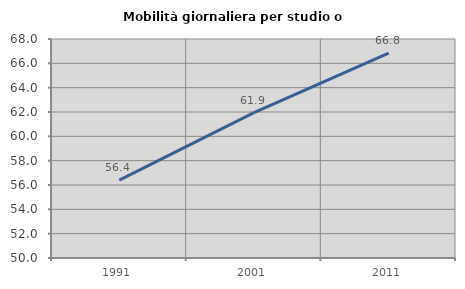
| Category | Mobilità giornaliera per studio o lavoro |
|---|---|
| 1991.0 | 56.399 |
| 2001.0 | 61.944 |
| 2011.0 | 66.849 |